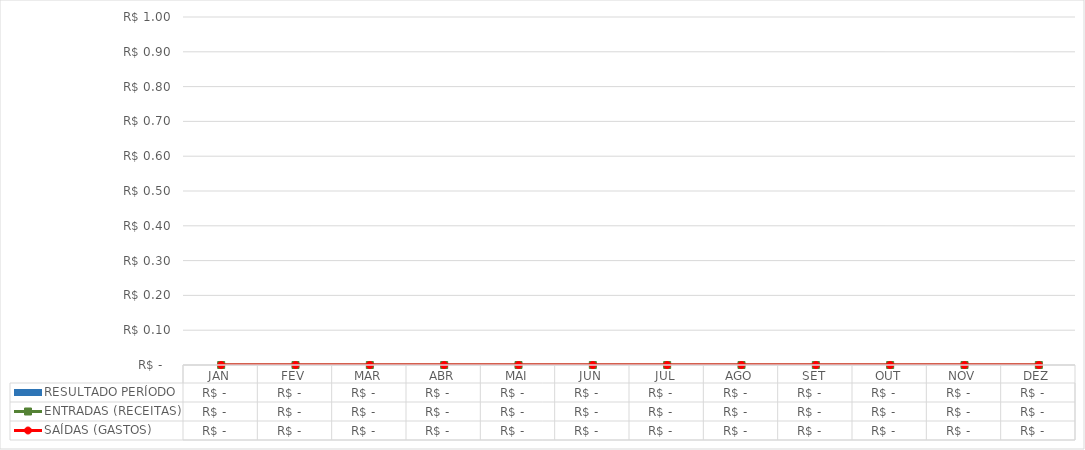
| Category | RESULTADO PERÍODO |
|---|---|
| JAN | 0 |
| FEV | 0 |
| MAR | 0 |
| ABR | 0 |
| MAI | 0 |
| JUN | 0 |
| JUL | 0 |
| AGO | 0 |
| SET | 0 |
| OUT | 0 |
| NOV | 0 |
| DEZ | 0 |